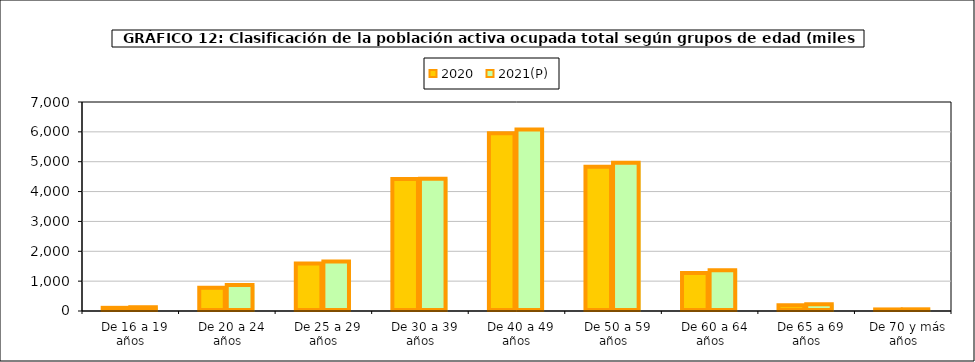
| Category | 2020 | 2021(P) |
|---|---|---|
|   De 16 a 19 años | 106.375 | 126.35 |
|   De 20 a 24 años | 777.5 | 869 |
|   De 25 a 29 años | 1594.55 | 1660.775 |
|   De 30 a 39 años | 4424.175 | 4430.325 |
|   De 40 a 49 años | 5951.6 | 6076.375 |
|   De 50 a 59 años | 4832.15 | 4962.85 |
|   De 60 a 64 años | 1271.3 | 1367.4 |
|   De 65 a 69 años | 192.75 | 224.2 |
|   De 70 y más años | 52.125 | 56.35 |